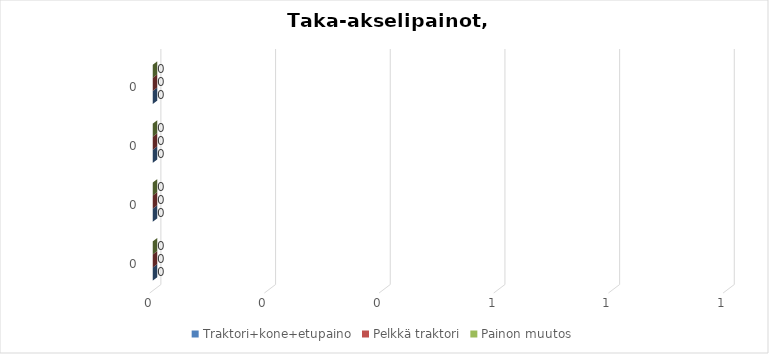
| Category | Traktori+kone+etupaino | Pelkkä traktori | Painon muutos |
|---|---|---|---|
| 0.0 | 0 | 0 | 0 |
| 0.0 | 0 | 0 | 0 |
| 0.0 | 0 | 0 | 0 |
| 0.0 | 0 | 0 | 0 |